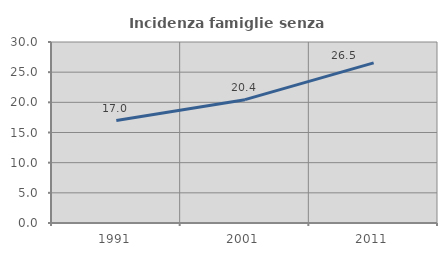
| Category | Incidenza famiglie senza nuclei |
|---|---|
| 1991.0 | 16.974 |
| 2001.0 | 20.443 |
| 2011.0 | 26.531 |